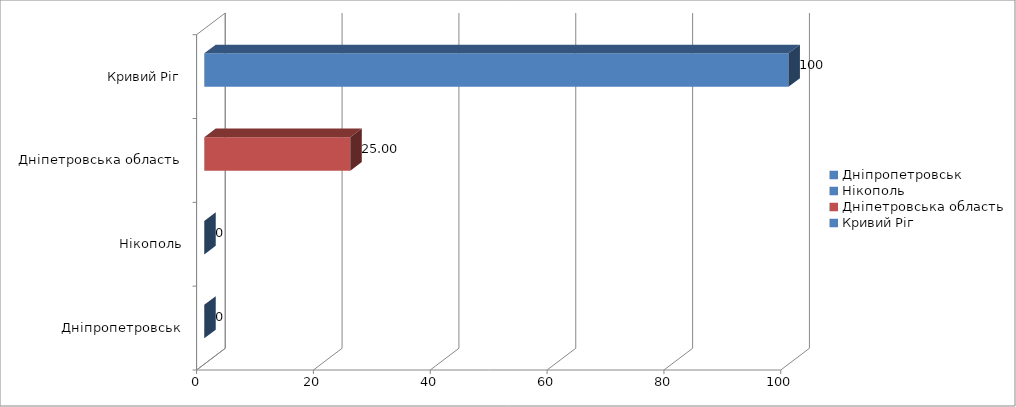
| Category | Series 0 |
|---|---|
| Дніпропетровськ | 0 |
| Нікополь | 0 |
| Дніпетровська область | 25 |
| Кривий Ріг | 100 |